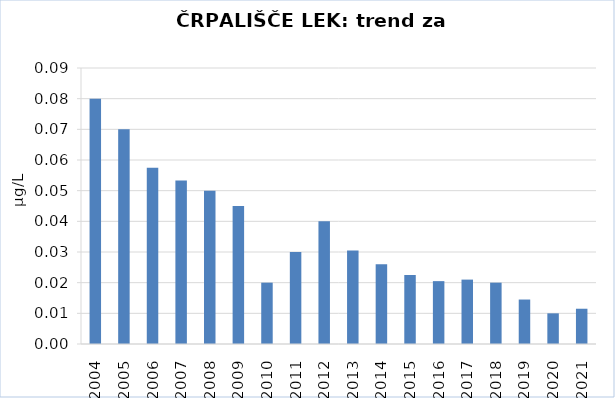
| Category | Vsota |
|---|---|
| 2004 | 0.08 |
| 2005 | 0.07 |
| 2006 | 0.057 |
| 2007 | 0.053 |
| 2008 | 0.05 |
| 2009 | 0.045 |
| 2010 | 0.02 |
| 2011 | 0.03 |
| 2012 | 0.04 |
| 2013 | 0.03 |
| 2014 | 0.026 |
| 2015 | 0.022 |
| 2016 | 0.02 |
| 2017 | 0.021 |
| 2018 | 0.02 |
| 2019 | 0.014 |
| 2020 | 0.01 |
| 2021 | 0.012 |